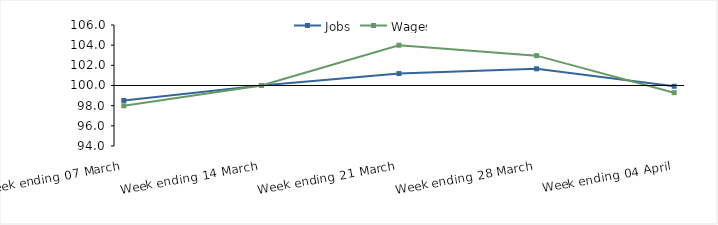
| Category | Jobs | Wages |
|---|---|---|
| 0 | 98.518 | 97.988 |
| 1900-01-01 | 100 | 100 |
| 1900-01-02 | 101.183 | 103.994 |
| 1900-01-03 | 101.654 | 102.961 |
| 1900-01-04 | 99.927 | 99.29 |